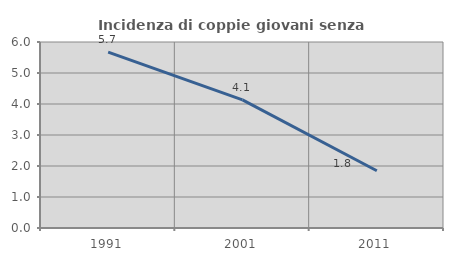
| Category | Incidenza di coppie giovani senza figli |
|---|---|
| 1991.0 | 5.671 |
| 2001.0 | 4.135 |
| 2011.0 | 1.848 |